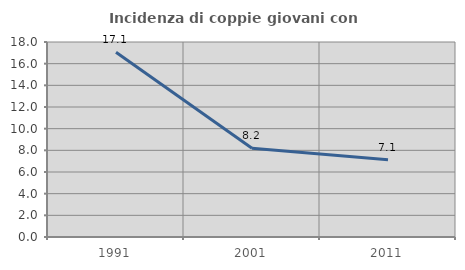
| Category | Incidenza di coppie giovani con figli |
|---|---|
| 1991.0 | 17.058 |
| 2001.0 | 8.192 |
| 2011.0 | 7.133 |